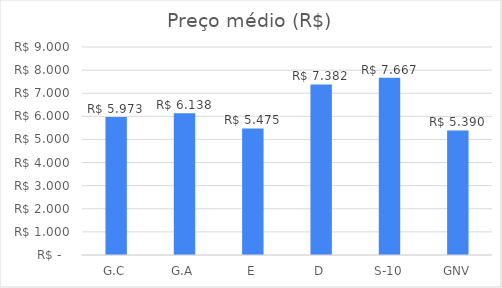
| Category | Series 0 |
|---|---|
| G.C | 5.973 |
| G.A | 6.138 |
| E | 5.475 |
| D | 7.382 |
| S-10 | 7.667 |
| GNV | 5.39 |